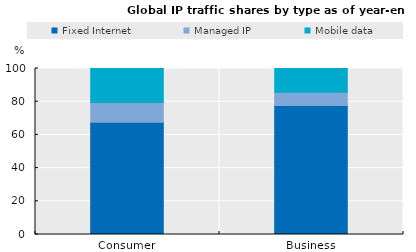
| Category | Fixed Internet | Managed IP | Mobile data |
|---|---|---|---|
| Consumer | 67.568 | 12.012 | 20.42 |
| Business | 77.778 | 7.937 | 14.286 |